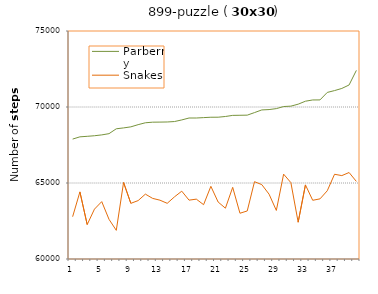
| Category | Parberry | Snakes |
|---|---|---|
| 0 | 67889 | 62783 |
| 1 | 68037 | 64415 |
| 2 | 68071 | 62265 |
| 3 | 68109 | 63281 |
| 4 | 68165 | 63775 |
| 5 | 68246 | 62610 |
| 6 | 68567 | 61885 |
| 7 | 68624 | 65034 |
| 8 | 68694 | 63662 |
| 9 | 68838 | 63842 |
| 10 | 68962 | 64268 |
| 11 | 69001 | 63987 |
| 12 | 69006 | 63870 |
| 13 | 69015 | 63663 |
| 14 | 69043 | 64089 |
| 15 | 69149 | 64463 |
| 16 | 69276 | 63872 |
| 17 | 69276 | 63938 |
| 18 | 69302 | 63574 |
| 19 | 69326 | 64782 |
| 20 | 69328 | 63748 |
| 21 | 69376 | 63342 |
| 22 | 69449 | 64715 |
| 23 | 69456 | 63010 |
| 24 | 69464 | 63162 |
| 25 | 69633 | 65087 |
| 26 | 69807 | 64893 |
| 27 | 69831 | 64265 |
| 28 | 69894 | 63194 |
| 29 | 70030 | 65582 |
| 30 | 70056 | 65024 |
| 31 | 70186 | 62420 |
| 32 | 70381 | 64875 |
| 33 | 70463 | 63863 |
| 34 | 70466 | 63956 |
| 35 | 70959 | 64489 |
| 36 | 71080 | 65574 |
| 37 | 71221 | 65487 |
| 38 | 71449 | 65689 |
| 39 | 72409 | 65103 |